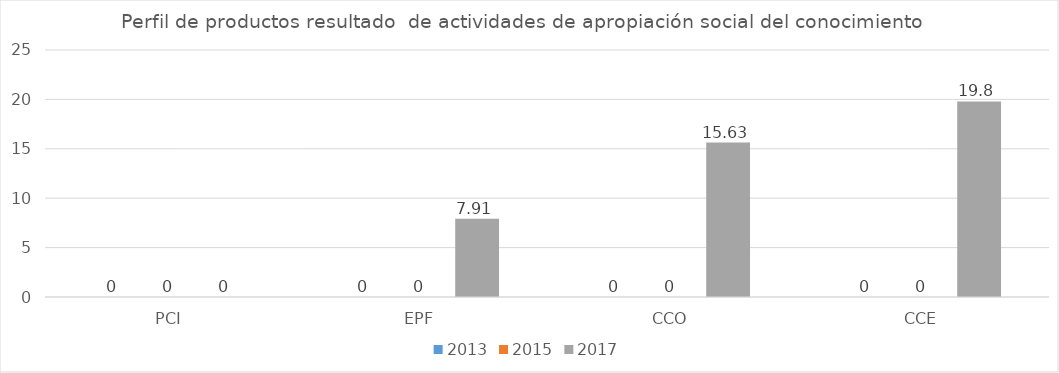
| Category | 2013 | 2015 | 2017 |
|---|---|---|---|
| PCI | 0 | 0 | 0 |
| EPF | 0 | 0 | 7.91 |
| CCO | 0 | 0 | 15.63 |
| CCE | 0 | 0 | 19.8 |